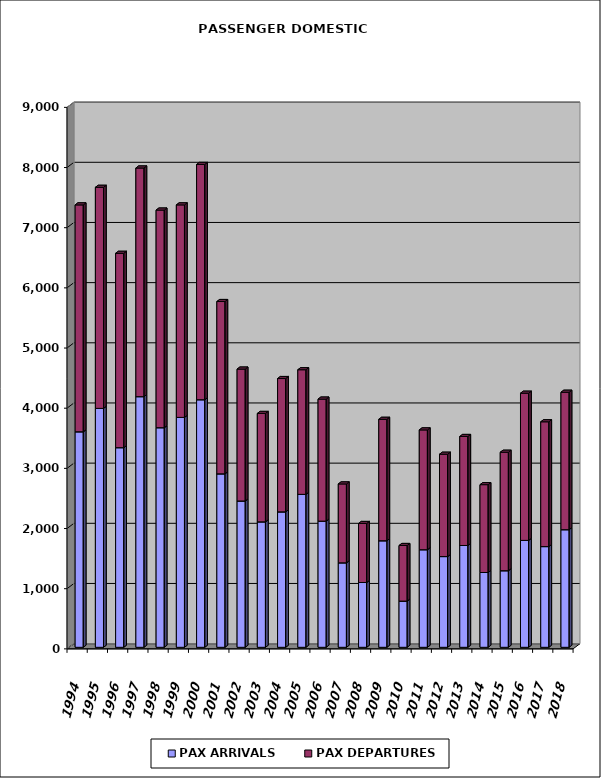
| Category | PAX ARRIVALS | PAX DEPARTURES |
|---|---|---|
| 1994.0 | 3582 | 3771 |
| 1995.0 | 3971 | 3674 |
| 1996.0 | 3318 | 3230 |
| 1997.0 | 4166 | 3800 |
| 1998.0 | 3650 | 3617 |
| 1999.0 | 3821 | 3532 |
| 2000.0 | 4115 | 3910 |
| 2001.0 | 2883 | 2864 |
| 2002.0 | 2432 | 2192 |
| 2003.0 | 2085 | 1802 |
| 2004.0 | 2251 | 2216 |
| 2005.0 | 2542 | 2071 |
| 2006.0 | 2097 | 2028 |
| 2007.0 | 1404 | 1311 |
| 2008.0 | 1077 | 981 |
| 2009.0 | 1771 | 2018 |
| 2010.0 | 768 | 924 |
| 2011.0 | 1622 | 1991 |
| 2012.0 | 1508 | 1701 |
| 2013.0 | 1692 | 1812 |
| 2014.0 | 1243 | 1460 |
| 2015.0 | 1273 | 1969 |
| 2016.0 | 1777 | 2446 |
| 2017.0 | 1674 | 2074 |
| 2018.0 | 1955 | 2284 |